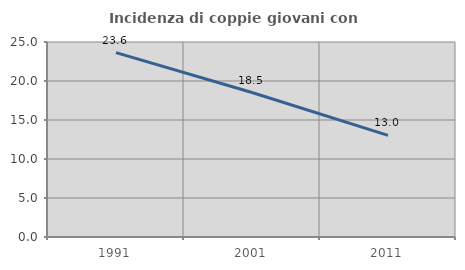
| Category | Incidenza di coppie giovani con figli |
|---|---|
| 1991.0 | 23.633 |
| 2001.0 | 18.52 |
| 2011.0 | 13.025 |